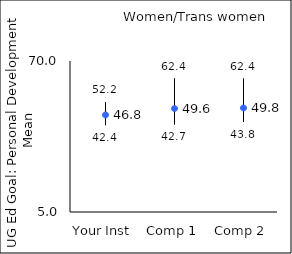
| Category | 25th percentile | 75th percentile | Mean |
|---|---|---|---|
| Your Inst | 42.4 | 52.2 | 46.78 |
| Comp 1 | 42.7 | 62.4 | 49.55 |
| Comp 2 | 43.8 | 62.4 | 49.79 |